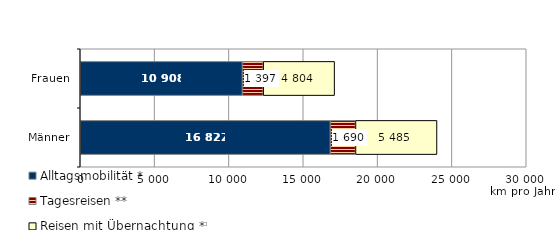
| Category | Alltagsmobilität * | Tagesreisen ** | Reisen mit Übernachtung *** |
|---|---|---|---|
| Männer | 16822.133 | 1690.194 | 5484.72 |
| Frauen | 10908.191 | 1396.603 | 4803.829 |